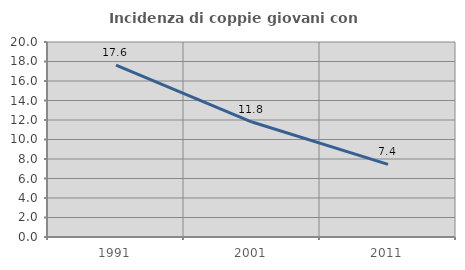
| Category | Incidenza di coppie giovani con figli |
|---|---|
| 1991.0 | 17.64 |
| 2001.0 | 11.79 |
| 2011.0 | 7.448 |